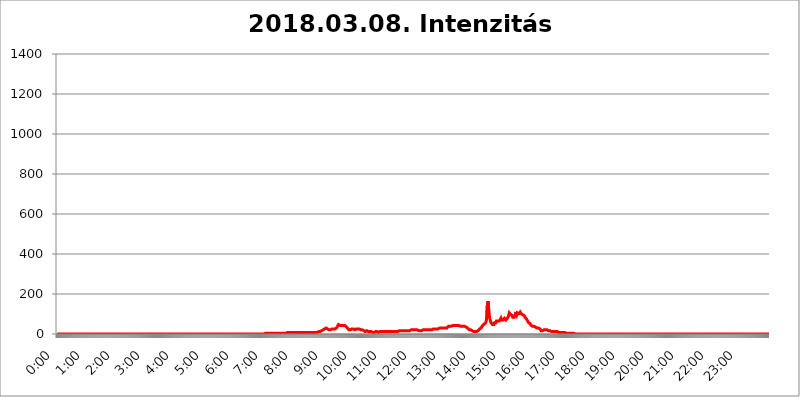
| Category | 2018.03.08. Intenzitás [W/m^2] |
|---|---|
| 0.0 | 0 |
| 0.0006944444444444445 | 0 |
| 0.001388888888888889 | 0 |
| 0.0020833333333333333 | 0 |
| 0.002777777777777778 | 0 |
| 0.003472222222222222 | 0 |
| 0.004166666666666667 | 0 |
| 0.004861111111111111 | 0 |
| 0.005555555555555556 | 0 |
| 0.0062499999999999995 | 0 |
| 0.006944444444444444 | 0 |
| 0.007638888888888889 | 0 |
| 0.008333333333333333 | 0 |
| 0.009027777777777779 | 0 |
| 0.009722222222222222 | 0 |
| 0.010416666666666666 | 0 |
| 0.011111111111111112 | 0 |
| 0.011805555555555555 | 0 |
| 0.012499999999999999 | 0 |
| 0.013194444444444444 | 0 |
| 0.013888888888888888 | 0 |
| 0.014583333333333332 | 0 |
| 0.015277777777777777 | 0 |
| 0.015972222222222224 | 0 |
| 0.016666666666666666 | 0 |
| 0.017361111111111112 | 0 |
| 0.018055555555555557 | 0 |
| 0.01875 | 0 |
| 0.019444444444444445 | 0 |
| 0.02013888888888889 | 0 |
| 0.020833333333333332 | 0 |
| 0.02152777777777778 | 0 |
| 0.022222222222222223 | 0 |
| 0.02291666666666667 | 0 |
| 0.02361111111111111 | 0 |
| 0.024305555555555556 | 0 |
| 0.024999999999999998 | 0 |
| 0.025694444444444447 | 0 |
| 0.02638888888888889 | 0 |
| 0.027083333333333334 | 0 |
| 0.027777777777777776 | 0 |
| 0.02847222222222222 | 0 |
| 0.029166666666666664 | 0 |
| 0.029861111111111113 | 0 |
| 0.030555555555555555 | 0 |
| 0.03125 | 0 |
| 0.03194444444444445 | 0 |
| 0.03263888888888889 | 0 |
| 0.03333333333333333 | 0 |
| 0.034027777777777775 | 0 |
| 0.034722222222222224 | 0 |
| 0.035416666666666666 | 0 |
| 0.036111111111111115 | 0 |
| 0.03680555555555556 | 0 |
| 0.0375 | 0 |
| 0.03819444444444444 | 0 |
| 0.03888888888888889 | 0 |
| 0.03958333333333333 | 0 |
| 0.04027777777777778 | 0 |
| 0.04097222222222222 | 0 |
| 0.041666666666666664 | 0 |
| 0.042361111111111106 | 0 |
| 0.04305555555555556 | 0 |
| 0.043750000000000004 | 0 |
| 0.044444444444444446 | 0 |
| 0.04513888888888889 | 0 |
| 0.04583333333333334 | 0 |
| 0.04652777777777778 | 0 |
| 0.04722222222222222 | 0 |
| 0.04791666666666666 | 0 |
| 0.04861111111111111 | 0 |
| 0.049305555555555554 | 0 |
| 0.049999999999999996 | 0 |
| 0.05069444444444445 | 0 |
| 0.051388888888888894 | 0 |
| 0.052083333333333336 | 0 |
| 0.05277777777777778 | 0 |
| 0.05347222222222222 | 0 |
| 0.05416666666666667 | 0 |
| 0.05486111111111111 | 0 |
| 0.05555555555555555 | 0 |
| 0.05625 | 0 |
| 0.05694444444444444 | 0 |
| 0.057638888888888885 | 0 |
| 0.05833333333333333 | 0 |
| 0.05902777777777778 | 0 |
| 0.059722222222222225 | 0 |
| 0.06041666666666667 | 0 |
| 0.061111111111111116 | 0 |
| 0.06180555555555556 | 0 |
| 0.0625 | 0 |
| 0.06319444444444444 | 0 |
| 0.06388888888888888 | 0 |
| 0.06458333333333334 | 0 |
| 0.06527777777777778 | 0 |
| 0.06597222222222222 | 0 |
| 0.06666666666666667 | 0 |
| 0.06736111111111111 | 0 |
| 0.06805555555555555 | 0 |
| 0.06874999999999999 | 0 |
| 0.06944444444444443 | 0 |
| 0.07013888888888889 | 0 |
| 0.07083333333333333 | 0 |
| 0.07152777777777779 | 0 |
| 0.07222222222222223 | 0 |
| 0.07291666666666667 | 0 |
| 0.07361111111111111 | 0 |
| 0.07430555555555556 | 0 |
| 0.075 | 0 |
| 0.07569444444444444 | 0 |
| 0.0763888888888889 | 0 |
| 0.07708333333333334 | 0 |
| 0.07777777777777778 | 0 |
| 0.07847222222222222 | 0 |
| 0.07916666666666666 | 0 |
| 0.0798611111111111 | 0 |
| 0.08055555555555556 | 0 |
| 0.08125 | 0 |
| 0.08194444444444444 | 0 |
| 0.08263888888888889 | 0 |
| 0.08333333333333333 | 0 |
| 0.08402777777777777 | 0 |
| 0.08472222222222221 | 0 |
| 0.08541666666666665 | 0 |
| 0.08611111111111112 | 0 |
| 0.08680555555555557 | 0 |
| 0.08750000000000001 | 0 |
| 0.08819444444444445 | 0 |
| 0.08888888888888889 | 0 |
| 0.08958333333333333 | 0 |
| 0.09027777777777778 | 0 |
| 0.09097222222222222 | 0 |
| 0.09166666666666667 | 0 |
| 0.09236111111111112 | 0 |
| 0.09305555555555556 | 0 |
| 0.09375 | 0 |
| 0.09444444444444444 | 0 |
| 0.09513888888888888 | 0 |
| 0.09583333333333333 | 0 |
| 0.09652777777777777 | 0 |
| 0.09722222222222222 | 0 |
| 0.09791666666666667 | 0 |
| 0.09861111111111111 | 0 |
| 0.09930555555555555 | 0 |
| 0.09999999999999999 | 0 |
| 0.10069444444444443 | 0 |
| 0.1013888888888889 | 0 |
| 0.10208333333333335 | 0 |
| 0.10277777777777779 | 0 |
| 0.10347222222222223 | 0 |
| 0.10416666666666667 | 0 |
| 0.10486111111111111 | 0 |
| 0.10555555555555556 | 0 |
| 0.10625 | 0 |
| 0.10694444444444444 | 0 |
| 0.1076388888888889 | 0 |
| 0.10833333333333334 | 0 |
| 0.10902777777777778 | 0 |
| 0.10972222222222222 | 0 |
| 0.1111111111111111 | 0 |
| 0.11180555555555556 | 0 |
| 0.11180555555555556 | 0 |
| 0.1125 | 0 |
| 0.11319444444444444 | 0 |
| 0.11388888888888889 | 0 |
| 0.11458333333333333 | 0 |
| 0.11527777777777777 | 0 |
| 0.11597222222222221 | 0 |
| 0.11666666666666665 | 0 |
| 0.1173611111111111 | 0 |
| 0.11805555555555557 | 0 |
| 0.11944444444444445 | 0 |
| 0.12013888888888889 | 0 |
| 0.12083333333333333 | 0 |
| 0.12152777777777778 | 0 |
| 0.12222222222222223 | 0 |
| 0.12291666666666667 | 0 |
| 0.12291666666666667 | 0 |
| 0.12361111111111112 | 0 |
| 0.12430555555555556 | 0 |
| 0.125 | 0 |
| 0.12569444444444444 | 0 |
| 0.12638888888888888 | 0 |
| 0.12708333333333333 | 0 |
| 0.16875 | 0 |
| 0.12847222222222224 | 0 |
| 0.12916666666666668 | 0 |
| 0.12986111111111112 | 0 |
| 0.13055555555555556 | 0 |
| 0.13125 | 0 |
| 0.13194444444444445 | 0 |
| 0.1326388888888889 | 0 |
| 0.13333333333333333 | 0 |
| 0.13402777777777777 | 0 |
| 0.13402777777777777 | 0 |
| 0.13472222222222222 | 0 |
| 0.13541666666666666 | 0 |
| 0.1361111111111111 | 0 |
| 0.13749999999999998 | 0 |
| 0.13819444444444443 | 0 |
| 0.1388888888888889 | 0 |
| 0.13958333333333334 | 0 |
| 0.14027777777777778 | 0 |
| 0.14097222222222222 | 0 |
| 0.14166666666666666 | 0 |
| 0.1423611111111111 | 0 |
| 0.14305555555555557 | 0 |
| 0.14375000000000002 | 0 |
| 0.14444444444444446 | 0 |
| 0.1451388888888889 | 0 |
| 0.1451388888888889 | 0 |
| 0.14652777777777778 | 0 |
| 0.14722222222222223 | 0 |
| 0.14791666666666667 | 0 |
| 0.1486111111111111 | 0 |
| 0.14930555555555555 | 0 |
| 0.15 | 0 |
| 0.15069444444444444 | 0 |
| 0.15138888888888888 | 0 |
| 0.15208333333333332 | 0 |
| 0.15277777777777776 | 0 |
| 0.15347222222222223 | 0 |
| 0.15416666666666667 | 0 |
| 0.15486111111111112 | 0 |
| 0.15555555555555556 | 0 |
| 0.15625 | 0 |
| 0.15694444444444444 | 0 |
| 0.15763888888888888 | 0 |
| 0.15833333333333333 | 0 |
| 0.15902777777777777 | 0 |
| 0.15972222222222224 | 0 |
| 0.16041666666666668 | 0 |
| 0.16111111111111112 | 0 |
| 0.16180555555555556 | 0 |
| 0.1625 | 0 |
| 0.16319444444444445 | 0 |
| 0.1638888888888889 | 0 |
| 0.16458333333333333 | 0 |
| 0.16527777777777777 | 0 |
| 0.16597222222222222 | 0 |
| 0.16666666666666666 | 0 |
| 0.1673611111111111 | 0 |
| 0.16805555555555554 | 0 |
| 0.16874999999999998 | 0 |
| 0.16944444444444443 | 0 |
| 0.17013888888888887 | 0 |
| 0.1708333333333333 | 0 |
| 0.17152777777777775 | 0 |
| 0.17222222222222225 | 0 |
| 0.1729166666666667 | 0 |
| 0.17361111111111113 | 0 |
| 0.17430555555555557 | 0 |
| 0.17500000000000002 | 0 |
| 0.17569444444444446 | 0 |
| 0.1763888888888889 | 0 |
| 0.17708333333333334 | 0 |
| 0.17777777777777778 | 0 |
| 0.17847222222222223 | 0 |
| 0.17916666666666667 | 0 |
| 0.1798611111111111 | 0 |
| 0.18055555555555555 | 0 |
| 0.18125 | 0 |
| 0.18194444444444444 | 0 |
| 0.1826388888888889 | 0 |
| 0.18333333333333335 | 0 |
| 0.1840277777777778 | 0 |
| 0.18472222222222223 | 0 |
| 0.18541666666666667 | 0 |
| 0.18611111111111112 | 0 |
| 0.18680555555555556 | 0 |
| 0.1875 | 0 |
| 0.18819444444444444 | 0 |
| 0.18888888888888888 | 0 |
| 0.18958333333333333 | 0 |
| 0.19027777777777777 | 0 |
| 0.1909722222222222 | 0 |
| 0.19166666666666665 | 0 |
| 0.19236111111111112 | 0 |
| 0.19305555555555554 | 0 |
| 0.19375 | 0 |
| 0.19444444444444445 | 0 |
| 0.1951388888888889 | 0 |
| 0.19583333333333333 | 0 |
| 0.19652777777777777 | 0 |
| 0.19722222222222222 | 0 |
| 0.19791666666666666 | 0 |
| 0.1986111111111111 | 0 |
| 0.19930555555555554 | 0 |
| 0.19999999999999998 | 0 |
| 0.20069444444444443 | 0 |
| 0.20138888888888887 | 0 |
| 0.2020833333333333 | 0 |
| 0.2027777777777778 | 0 |
| 0.2034722222222222 | 0 |
| 0.2041666666666667 | 0 |
| 0.20486111111111113 | 0 |
| 0.20555555555555557 | 0 |
| 0.20625000000000002 | 0 |
| 0.20694444444444446 | 0 |
| 0.2076388888888889 | 0 |
| 0.20833333333333334 | 0 |
| 0.20902777777777778 | 0 |
| 0.20972222222222223 | 0 |
| 0.21041666666666667 | 0 |
| 0.2111111111111111 | 0 |
| 0.21180555555555555 | 0 |
| 0.2125 | 0 |
| 0.21319444444444444 | 0 |
| 0.2138888888888889 | 0 |
| 0.21458333333333335 | 0 |
| 0.2152777777777778 | 0 |
| 0.21597222222222223 | 0 |
| 0.21666666666666667 | 0 |
| 0.21736111111111112 | 0 |
| 0.21805555555555556 | 0 |
| 0.21875 | 0 |
| 0.21944444444444444 | 0 |
| 0.22013888888888888 | 0 |
| 0.22083333333333333 | 0 |
| 0.22152777777777777 | 0 |
| 0.2222222222222222 | 0 |
| 0.22291666666666665 | 0 |
| 0.2236111111111111 | 0 |
| 0.22430555555555556 | 0 |
| 0.225 | 0 |
| 0.22569444444444445 | 0 |
| 0.2263888888888889 | 0 |
| 0.22708333333333333 | 0 |
| 0.22777777777777777 | 0 |
| 0.22847222222222222 | 0 |
| 0.22916666666666666 | 0 |
| 0.2298611111111111 | 0 |
| 0.23055555555555554 | 0 |
| 0.23124999999999998 | 0 |
| 0.23194444444444443 | 0 |
| 0.23263888888888887 | 0 |
| 0.2333333333333333 | 0 |
| 0.2340277777777778 | 0 |
| 0.2347222222222222 | 0 |
| 0.2354166666666667 | 0 |
| 0.23611111111111113 | 0 |
| 0.23680555555555557 | 0 |
| 0.23750000000000002 | 0 |
| 0.23819444444444446 | 0 |
| 0.2388888888888889 | 0 |
| 0.23958333333333334 | 0 |
| 0.24027777777777778 | 0 |
| 0.24097222222222223 | 0 |
| 0.24166666666666667 | 0 |
| 0.2423611111111111 | 0 |
| 0.24305555555555555 | 0 |
| 0.24375 | 0 |
| 0.24444444444444446 | 0 |
| 0.24513888888888888 | 0 |
| 0.24583333333333335 | 0 |
| 0.2465277777777778 | 0 |
| 0.24722222222222223 | 0 |
| 0.24791666666666667 | 0 |
| 0.24861111111111112 | 0 |
| 0.24930555555555556 | 0 |
| 0.25 | 0 |
| 0.25069444444444444 | 0 |
| 0.2513888888888889 | 0 |
| 0.2520833333333333 | 0 |
| 0.25277777777777777 | 0 |
| 0.2534722222222222 | 0 |
| 0.25416666666666665 | 0 |
| 0.2548611111111111 | 0 |
| 0.2555555555555556 | 0 |
| 0.25625000000000003 | 0 |
| 0.2569444444444445 | 0 |
| 0.2576388888888889 | 0 |
| 0.25833333333333336 | 0 |
| 0.2590277777777778 | 0 |
| 0.25972222222222224 | 0 |
| 0.2604166666666667 | 0 |
| 0.2611111111111111 | 0 |
| 0.26180555555555557 | 0 |
| 0.2625 | 0 |
| 0.26319444444444445 | 0 |
| 0.2638888888888889 | 0 |
| 0.26458333333333334 | 0 |
| 0.2652777777777778 | 0 |
| 0.2659722222222222 | 0 |
| 0.26666666666666666 | 0 |
| 0.2673611111111111 | 0 |
| 0.26805555555555555 | 0 |
| 0.26875 | 0 |
| 0.26944444444444443 | 0 |
| 0.2701388888888889 | 0 |
| 0.2708333333333333 | 0 |
| 0.27152777777777776 | 0 |
| 0.2722222222222222 | 0 |
| 0.27291666666666664 | 0 |
| 0.2736111111111111 | 0 |
| 0.2743055555555555 | 0 |
| 0.27499999999999997 | 0 |
| 0.27569444444444446 | 0 |
| 0.27638888888888885 | 0 |
| 0.27708333333333335 | 0 |
| 0.2777777777777778 | 0 |
| 0.27847222222222223 | 0 |
| 0.2791666666666667 | 0 |
| 0.2798611111111111 | 0 |
| 0.28055555555555556 | 0 |
| 0.28125 | 0 |
| 0.28194444444444444 | 0 |
| 0.2826388888888889 | 0 |
| 0.2833333333333333 | 0 |
| 0.28402777777777777 | 0 |
| 0.2847222222222222 | 0 |
| 0.28541666666666665 | 0 |
| 0.28611111111111115 | 0 |
| 0.28680555555555554 | 0 |
| 0.28750000000000003 | 0 |
| 0.2881944444444445 | 0 |
| 0.2888888888888889 | 0 |
| 0.28958333333333336 | 0 |
| 0.2902777777777778 | 0 |
| 0.29097222222222224 | 0 |
| 0.2916666666666667 | 3.525 |
| 0.2923611111111111 | 0 |
| 0.29305555555555557 | 3.525 |
| 0.29375 | 3.525 |
| 0.29444444444444445 | 0 |
| 0.2951388888888889 | 0 |
| 0.29583333333333334 | 3.525 |
| 0.2965277777777778 | 3.525 |
| 0.2972222222222222 | 3.525 |
| 0.29791666666666666 | 3.525 |
| 0.2986111111111111 | 3.525 |
| 0.29930555555555555 | 3.525 |
| 0.3 | 3.525 |
| 0.30069444444444443 | 3.525 |
| 0.3013888888888889 | 3.525 |
| 0.3020833333333333 | 3.525 |
| 0.30277777777777776 | 3.525 |
| 0.3034722222222222 | 3.525 |
| 0.30416666666666664 | 3.525 |
| 0.3048611111111111 | 3.525 |
| 0.3055555555555555 | 3.525 |
| 0.30624999999999997 | 3.525 |
| 0.3069444444444444 | 3.525 |
| 0.3076388888888889 | 3.525 |
| 0.30833333333333335 | 3.525 |
| 0.3090277777777778 | 3.525 |
| 0.30972222222222223 | 3.525 |
| 0.3104166666666667 | 3.525 |
| 0.3111111111111111 | 3.525 |
| 0.31180555555555556 | 3.525 |
| 0.3125 | 3.525 |
| 0.31319444444444444 | 3.525 |
| 0.3138888888888889 | 3.525 |
| 0.3145833333333333 | 3.525 |
| 0.31527777777777777 | 3.525 |
| 0.3159722222222222 | 3.525 |
| 0.31666666666666665 | 3.525 |
| 0.31736111111111115 | 3.525 |
| 0.31805555555555554 | 3.525 |
| 0.31875000000000003 | 3.525 |
| 0.3194444444444445 | 3.525 |
| 0.3201388888888889 | 7.887 |
| 0.32083333333333336 | 3.525 |
| 0.3215277777777778 | 3.525 |
| 0.32222222222222224 | 7.887 |
| 0.3229166666666667 | 7.887 |
| 0.3236111111111111 | 7.887 |
| 0.32430555555555557 | 7.887 |
| 0.325 | 7.887 |
| 0.32569444444444445 | 7.887 |
| 0.3263888888888889 | 7.887 |
| 0.32708333333333334 | 7.887 |
| 0.3277777777777778 | 7.887 |
| 0.3284722222222222 | 7.887 |
| 0.32916666666666666 | 7.887 |
| 0.3298611111111111 | 7.887 |
| 0.33055555555555555 | 7.887 |
| 0.33125 | 7.887 |
| 0.33194444444444443 | 7.887 |
| 0.3326388888888889 | 7.887 |
| 0.3333333333333333 | 7.887 |
| 0.3340277777777778 | 7.887 |
| 0.3347222222222222 | 7.887 |
| 0.3354166666666667 | 7.887 |
| 0.3361111111111111 | 7.887 |
| 0.3368055555555556 | 7.887 |
| 0.33749999999999997 | 7.887 |
| 0.33819444444444446 | 7.887 |
| 0.33888888888888885 | 7.887 |
| 0.33958333333333335 | 7.887 |
| 0.34027777777777773 | 7.887 |
| 0.34097222222222223 | 7.887 |
| 0.3416666666666666 | 7.887 |
| 0.3423611111111111 | 7.887 |
| 0.3430555555555555 | 7.887 |
| 0.34375 | 7.887 |
| 0.3444444444444445 | 7.887 |
| 0.3451388888888889 | 7.887 |
| 0.3458333333333334 | 7.887 |
| 0.34652777777777777 | 7.887 |
| 0.34722222222222227 | 7.887 |
| 0.34791666666666665 | 7.887 |
| 0.34861111111111115 | 7.887 |
| 0.34930555555555554 | 7.887 |
| 0.35000000000000003 | 7.887 |
| 0.3506944444444444 | 7.887 |
| 0.3513888888888889 | 7.887 |
| 0.3520833333333333 | 7.887 |
| 0.3527777777777778 | 7.887 |
| 0.3534722222222222 | 7.887 |
| 0.3541666666666667 | 7.887 |
| 0.3548611111111111 | 7.887 |
| 0.35555555555555557 | 7.887 |
| 0.35625 | 7.887 |
| 0.35694444444444445 | 7.887 |
| 0.3576388888888889 | 7.887 |
| 0.35833333333333334 | 7.887 |
| 0.3590277777777778 | 7.887 |
| 0.3597222222222222 | 7.887 |
| 0.36041666666666666 | 7.887 |
| 0.3611111111111111 | 7.887 |
| 0.36180555555555555 | 7.887 |
| 0.3625 | 7.887 |
| 0.36319444444444443 | 7.887 |
| 0.3638888888888889 | 7.887 |
| 0.3645833333333333 | 7.887 |
| 0.3652777777777778 | 7.887 |
| 0.3659722222222222 | 12.257 |
| 0.3666666666666667 | 12.257 |
| 0.3673611111111111 | 12.257 |
| 0.3680555555555556 | 12.257 |
| 0.36874999999999997 | 12.257 |
| 0.36944444444444446 | 12.257 |
| 0.37013888888888885 | 12.257 |
| 0.37083333333333335 | 16.636 |
| 0.37152777777777773 | 16.636 |
| 0.37222222222222223 | 16.636 |
| 0.3729166666666666 | 21.024 |
| 0.3736111111111111 | 21.024 |
| 0.3743055555555555 | 21.024 |
| 0.375 | 25.419 |
| 0.3756944444444445 | 25.419 |
| 0.3763888888888889 | 25.419 |
| 0.3770833333333334 | 29.823 |
| 0.37777777777777777 | 29.823 |
| 0.37847222222222227 | 25.419 |
| 0.37916666666666665 | 25.419 |
| 0.37986111111111115 | 25.419 |
| 0.38055555555555554 | 25.419 |
| 0.38125000000000003 | 21.024 |
| 0.3819444444444444 | 21.024 |
| 0.3826388888888889 | 21.024 |
| 0.3833333333333333 | 21.024 |
| 0.3840277777777778 | 21.024 |
| 0.3847222222222222 | 25.419 |
| 0.3854166666666667 | 25.419 |
| 0.3861111111111111 | 25.419 |
| 0.38680555555555557 | 21.024 |
| 0.3875 | 25.419 |
| 0.38819444444444445 | 25.419 |
| 0.3888888888888889 | 25.419 |
| 0.38958333333333334 | 25.419 |
| 0.3902777777777778 | 25.419 |
| 0.3909722222222222 | 25.419 |
| 0.39166666666666666 | 29.823 |
| 0.3923611111111111 | 34.234 |
| 0.39305555555555555 | 38.653 |
| 0.39375 | 43.079 |
| 0.39444444444444443 | 47.511 |
| 0.3951388888888889 | 47.511 |
| 0.3958333333333333 | 47.511 |
| 0.3965277777777778 | 43.079 |
| 0.3972222222222222 | 43.079 |
| 0.3979166666666667 | 43.079 |
| 0.3986111111111111 | 43.079 |
| 0.3993055555555556 | 43.079 |
| 0.39999999999999997 | 43.079 |
| 0.40069444444444446 | 43.079 |
| 0.40138888888888885 | 43.079 |
| 0.40208333333333335 | 43.079 |
| 0.40277777777777773 | 43.079 |
| 0.40347222222222223 | 43.079 |
| 0.4041666666666666 | 38.653 |
| 0.4048611111111111 | 38.653 |
| 0.4055555555555555 | 34.234 |
| 0.40625 | 34.234 |
| 0.4069444444444445 | 29.823 |
| 0.4076388888888889 | 29.823 |
| 0.4083333333333334 | 25.419 |
| 0.40902777777777777 | 21.024 |
| 0.40972222222222227 | 25.419 |
| 0.41041666666666665 | 25.419 |
| 0.41111111111111115 | 21.024 |
| 0.41180555555555554 | 21.024 |
| 0.41250000000000003 | 25.419 |
| 0.4131944444444444 | 25.419 |
| 0.4138888888888889 | 25.419 |
| 0.4145833333333333 | 25.419 |
| 0.4152777777777778 | 25.419 |
| 0.4159722222222222 | 25.419 |
| 0.4166666666666667 | 25.419 |
| 0.4173611111111111 | 21.024 |
| 0.41805555555555557 | 25.419 |
| 0.41875 | 25.419 |
| 0.41944444444444445 | 25.419 |
| 0.4201388888888889 | 21.024 |
| 0.42083333333333334 | 25.419 |
| 0.4215277777777778 | 25.419 |
| 0.4222222222222222 | 25.419 |
| 0.42291666666666666 | 25.419 |
| 0.4236111111111111 | 25.419 |
| 0.42430555555555555 | 21.024 |
| 0.425 | 21.024 |
| 0.42569444444444443 | 21.024 |
| 0.4263888888888889 | 16.636 |
| 0.4270833333333333 | 21.024 |
| 0.4277777777777778 | 21.024 |
| 0.4284722222222222 | 21.024 |
| 0.4291666666666667 | 21.024 |
| 0.4298611111111111 | 16.636 |
| 0.4305555555555556 | 16.636 |
| 0.43124999999999997 | 12.257 |
| 0.43194444444444446 | 12.257 |
| 0.43263888888888885 | 12.257 |
| 0.43333333333333335 | 12.257 |
| 0.43402777777777773 | 16.636 |
| 0.43472222222222223 | 16.636 |
| 0.4354166666666666 | 16.636 |
| 0.4361111111111111 | 12.257 |
| 0.4368055555555555 | 12.257 |
| 0.4375 | 12.257 |
| 0.4381944444444445 | 12.257 |
| 0.4388888888888889 | 12.257 |
| 0.4395833333333334 | 12.257 |
| 0.44027777777777777 | 12.257 |
| 0.44097222222222227 | 7.887 |
| 0.44166666666666665 | 7.887 |
| 0.44236111111111115 | 7.887 |
| 0.44305555555555554 | 7.887 |
| 0.44375000000000003 | 7.887 |
| 0.4444444444444444 | 7.887 |
| 0.4451388888888889 | 7.887 |
| 0.4458333333333333 | 12.257 |
| 0.4465277777777778 | 12.257 |
| 0.4472222222222222 | 12.257 |
| 0.4479166666666667 | 12.257 |
| 0.4486111111111111 | 12.257 |
| 0.44930555555555557 | 12.257 |
| 0.45 | 12.257 |
| 0.45069444444444445 | 7.887 |
| 0.4513888888888889 | 12.257 |
| 0.45208333333333334 | 12.257 |
| 0.4527777777777778 | 12.257 |
| 0.4534722222222222 | 12.257 |
| 0.45416666666666666 | 12.257 |
| 0.4548611111111111 | 12.257 |
| 0.45555555555555555 | 12.257 |
| 0.45625 | 12.257 |
| 0.45694444444444443 | 12.257 |
| 0.4576388888888889 | 12.257 |
| 0.4583333333333333 | 12.257 |
| 0.4590277777777778 | 12.257 |
| 0.4597222222222222 | 12.257 |
| 0.4604166666666667 | 12.257 |
| 0.4611111111111111 | 12.257 |
| 0.4618055555555556 | 12.257 |
| 0.46249999999999997 | 12.257 |
| 0.46319444444444446 | 12.257 |
| 0.46388888888888885 | 12.257 |
| 0.46458333333333335 | 12.257 |
| 0.46527777777777773 | 12.257 |
| 0.46597222222222223 | 12.257 |
| 0.4666666666666666 | 12.257 |
| 0.4673611111111111 | 12.257 |
| 0.4680555555555555 | 12.257 |
| 0.46875 | 12.257 |
| 0.4694444444444445 | 12.257 |
| 0.4701388888888889 | 12.257 |
| 0.4708333333333334 | 12.257 |
| 0.47152777777777777 | 12.257 |
| 0.47222222222222227 | 12.257 |
| 0.47291666666666665 | 12.257 |
| 0.47361111111111115 | 12.257 |
| 0.47430555555555554 | 12.257 |
| 0.47500000000000003 | 12.257 |
| 0.4756944444444444 | 12.257 |
| 0.4763888888888889 | 12.257 |
| 0.4770833333333333 | 12.257 |
| 0.4777777777777778 | 12.257 |
| 0.4784722222222222 | 12.257 |
| 0.4791666666666667 | 16.636 |
| 0.4798611111111111 | 16.636 |
| 0.48055555555555557 | 16.636 |
| 0.48125 | 16.636 |
| 0.48194444444444445 | 16.636 |
| 0.4826388888888889 | 16.636 |
| 0.48333333333333334 | 16.636 |
| 0.4840277777777778 | 16.636 |
| 0.4847222222222222 | 16.636 |
| 0.48541666666666666 | 16.636 |
| 0.4861111111111111 | 16.636 |
| 0.48680555555555555 | 16.636 |
| 0.4875 | 16.636 |
| 0.48819444444444443 | 16.636 |
| 0.4888888888888889 | 16.636 |
| 0.4895833333333333 | 16.636 |
| 0.4902777777777778 | 16.636 |
| 0.4909722222222222 | 16.636 |
| 0.4916666666666667 | 16.636 |
| 0.4923611111111111 | 16.636 |
| 0.4930555555555556 | 16.636 |
| 0.49374999999999997 | 16.636 |
| 0.49444444444444446 | 16.636 |
| 0.49513888888888885 | 16.636 |
| 0.49583333333333335 | 16.636 |
| 0.49652777777777773 | 21.024 |
| 0.49722222222222223 | 21.024 |
| 0.4979166666666666 | 21.024 |
| 0.4986111111111111 | 21.024 |
| 0.4993055555555555 | 21.024 |
| 0.5 | 21.024 |
| 0.5006944444444444 | 21.024 |
| 0.5013888888888889 | 16.636 |
| 0.5020833333333333 | 21.024 |
| 0.5027777777777778 | 21.024 |
| 0.5034722222222222 | 16.636 |
| 0.5041666666666667 | 21.024 |
| 0.5048611111111111 | 21.024 |
| 0.5055555555555555 | 16.636 |
| 0.50625 | 16.636 |
| 0.5069444444444444 | 16.636 |
| 0.5076388888888889 | 16.636 |
| 0.5083333333333333 | 16.636 |
| 0.5090277777777777 | 16.636 |
| 0.5097222222222222 | 16.636 |
| 0.5104166666666666 | 16.636 |
| 0.5111111111111112 | 16.636 |
| 0.5118055555555555 | 21.024 |
| 0.5125000000000001 | 21.024 |
| 0.5131944444444444 | 21.024 |
| 0.513888888888889 | 21.024 |
| 0.5145833333333333 | 21.024 |
| 0.5152777777777778 | 21.024 |
| 0.5159722222222222 | 21.024 |
| 0.5166666666666667 | 21.024 |
| 0.517361111111111 | 21.024 |
| 0.5180555555555556 | 21.024 |
| 0.5187499999999999 | 21.024 |
| 0.5194444444444445 | 21.024 |
| 0.5201388888888888 | 21.024 |
| 0.5208333333333334 | 21.024 |
| 0.5215277777777778 | 21.024 |
| 0.5222222222222223 | 21.024 |
| 0.5229166666666667 | 21.024 |
| 0.5236111111111111 | 21.024 |
| 0.5243055555555556 | 21.024 |
| 0.525 | 21.024 |
| 0.5256944444444445 | 21.024 |
| 0.5263888888888889 | 21.024 |
| 0.5270833333333333 | 21.024 |
| 0.5277777777777778 | 25.419 |
| 0.5284722222222222 | 25.419 |
| 0.5291666666666667 | 25.419 |
| 0.5298611111111111 | 25.419 |
| 0.5305555555555556 | 25.419 |
| 0.53125 | 25.419 |
| 0.5319444444444444 | 25.419 |
| 0.5326388888888889 | 25.419 |
| 0.5333333333333333 | 25.419 |
| 0.5340277777777778 | 25.419 |
| 0.5347222222222222 | 29.823 |
| 0.5354166666666667 | 29.823 |
| 0.5361111111111111 | 29.823 |
| 0.5368055555555555 | 29.823 |
| 0.5375 | 29.823 |
| 0.5381944444444444 | 29.823 |
| 0.5388888888888889 | 29.823 |
| 0.5395833333333333 | 29.823 |
| 0.5402777777777777 | 29.823 |
| 0.5409722222222222 | 29.823 |
| 0.5416666666666666 | 29.823 |
| 0.5423611111111112 | 29.823 |
| 0.5430555555555555 | 29.823 |
| 0.5437500000000001 | 29.823 |
| 0.5444444444444444 | 29.823 |
| 0.545138888888889 | 29.823 |
| 0.5458333333333333 | 29.823 |
| 0.5465277777777778 | 29.823 |
| 0.5472222222222222 | 34.234 |
| 0.5479166666666667 | 34.234 |
| 0.548611111111111 | 38.653 |
| 0.5493055555555556 | 38.653 |
| 0.5499999999999999 | 38.653 |
| 0.5506944444444445 | 38.653 |
| 0.5513888888888888 | 38.653 |
| 0.5520833333333334 | 38.653 |
| 0.5527777777777778 | 38.653 |
| 0.5534722222222223 | 38.653 |
| 0.5541666666666667 | 43.079 |
| 0.5548611111111111 | 43.079 |
| 0.5555555555555556 | 43.079 |
| 0.55625 | 43.079 |
| 0.5569444444444445 | 43.079 |
| 0.5576388888888889 | 43.079 |
| 0.5583333333333333 | 43.079 |
| 0.5590277777777778 | 43.079 |
| 0.5597222222222222 | 43.079 |
| 0.5604166666666667 | 43.079 |
| 0.5611111111111111 | 43.079 |
| 0.5618055555555556 | 43.079 |
| 0.5625 | 43.079 |
| 0.5631944444444444 | 43.079 |
| 0.5638888888888889 | 43.079 |
| 0.5645833333333333 | 43.079 |
| 0.5652777777777778 | 38.653 |
| 0.5659722222222222 | 38.653 |
| 0.5666666666666667 | 38.653 |
| 0.5673611111111111 | 38.653 |
| 0.5680555555555555 | 38.653 |
| 0.56875 | 38.653 |
| 0.5694444444444444 | 38.653 |
| 0.5701388888888889 | 38.653 |
| 0.5708333333333333 | 38.653 |
| 0.5715277777777777 | 38.653 |
| 0.5722222222222222 | 34.234 |
| 0.5729166666666666 | 34.234 |
| 0.5736111111111112 | 34.234 |
| 0.5743055555555555 | 29.823 |
| 0.5750000000000001 | 29.823 |
| 0.5756944444444444 | 29.823 |
| 0.576388888888889 | 25.419 |
| 0.5770833333333333 | 25.419 |
| 0.5777777777777778 | 21.024 |
| 0.5784722222222222 | 21.024 |
| 0.5791666666666667 | 21.024 |
| 0.579861111111111 | 21.024 |
| 0.5805555555555556 | 21.024 |
| 0.5812499999999999 | 16.636 |
| 0.5819444444444445 | 16.636 |
| 0.5826388888888888 | 16.636 |
| 0.5833333333333334 | 16.636 |
| 0.5840277777777778 | 12.257 |
| 0.5847222222222223 | 12.257 |
| 0.5854166666666667 | 12.257 |
| 0.5861111111111111 | 12.257 |
| 0.5868055555555556 | 12.257 |
| 0.5875 | 12.257 |
| 0.5881944444444445 | 12.257 |
| 0.5888888888888889 | 12.257 |
| 0.5895833333333333 | 16.636 |
| 0.5902777777777778 | 16.636 |
| 0.5909722222222222 | 21.024 |
| 0.5916666666666667 | 21.024 |
| 0.5923611111111111 | 25.419 |
| 0.5930555555555556 | 25.419 |
| 0.59375 | 29.823 |
| 0.5944444444444444 | 29.823 |
| 0.5951388888888889 | 34.234 |
| 0.5958333333333333 | 38.653 |
| 0.5965277777777778 | 38.653 |
| 0.5972222222222222 | 43.079 |
| 0.5979166666666667 | 47.511 |
| 0.5986111111111111 | 51.951 |
| 0.5993055555555555 | 51.951 |
| 0.6 | 51.951 |
| 0.6006944444444444 | 56.398 |
| 0.6013888888888889 | 60.85 |
| 0.6020833333333333 | 74.246 |
| 0.6027777777777777 | 137.347 |
| 0.6034722222222222 | 146.423 |
| 0.6041666666666666 | 164.605 |
| 0.6048611111111112 | 137.347 |
| 0.6055555555555555 | 137.347 |
| 0.6062500000000001 | 83.205 |
| 0.6069444444444444 | 74.246 |
| 0.607638888888889 | 65.31 |
| 0.6083333333333333 | 56.398 |
| 0.6090277777777778 | 51.951 |
| 0.6097222222222222 | 51.951 |
| 0.6104166666666667 | 47.511 |
| 0.611111111111111 | 47.511 |
| 0.6118055555555556 | 47.511 |
| 0.6124999999999999 | 47.511 |
| 0.6131944444444445 | 56.398 |
| 0.6138888888888888 | 56.398 |
| 0.6145833333333334 | 56.398 |
| 0.6152777777777778 | 56.398 |
| 0.6159722222222223 | 65.31 |
| 0.6166666666666667 | 65.31 |
| 0.6173611111111111 | 65.31 |
| 0.6180555555555556 | 65.31 |
| 0.61875 | 65.31 |
| 0.6194444444444445 | 60.85 |
| 0.6201388888888889 | 65.31 |
| 0.6208333333333333 | 69.775 |
| 0.6215277777777778 | 69.775 |
| 0.6222222222222222 | 78.722 |
| 0.6229166666666667 | 69.775 |
| 0.6236111111111111 | 74.246 |
| 0.6243055555555556 | 69.775 |
| 0.625 | 69.775 |
| 0.6256944444444444 | 69.775 |
| 0.6263888888888889 | 74.246 |
| 0.6270833333333333 | 78.722 |
| 0.6277777777777778 | 78.722 |
| 0.6284722222222222 | 74.246 |
| 0.6291666666666667 | 69.775 |
| 0.6298611111111111 | 69.775 |
| 0.6305555555555555 | 74.246 |
| 0.63125 | 78.722 |
| 0.6319444444444444 | 83.205 |
| 0.6326388888888889 | 87.692 |
| 0.6333333333333333 | 96.682 |
| 0.6340277777777777 | 105.69 |
| 0.6347222222222222 | 105.69 |
| 0.6354166666666666 | 105.69 |
| 0.6361111111111112 | 96.682 |
| 0.6368055555555555 | 92.184 |
| 0.6375000000000001 | 101.184 |
| 0.6381944444444444 | 92.184 |
| 0.638888888888889 | 83.205 |
| 0.6395833333333333 | 78.722 |
| 0.6402777777777778 | 78.722 |
| 0.6409722222222222 | 83.205 |
| 0.6416666666666667 | 83.205 |
| 0.642361111111111 | 92.184 |
| 0.6430555555555556 | 110.201 |
| 0.6437499999999999 | 105.69 |
| 0.6444444444444445 | 96.682 |
| 0.6451388888888888 | 105.69 |
| 0.6458333333333334 | 105.69 |
| 0.6465277777777778 | 101.184 |
| 0.6472222222222223 | 101.184 |
| 0.6479166666666667 | 101.184 |
| 0.6486111111111111 | 105.69 |
| 0.6493055555555556 | 110.201 |
| 0.65 | 105.69 |
| 0.6506944444444445 | 101.184 |
| 0.6513888888888889 | 101.184 |
| 0.6520833333333333 | 101.184 |
| 0.6527777777777778 | 96.682 |
| 0.6534722222222222 | 96.682 |
| 0.6541666666666667 | 92.184 |
| 0.6548611111111111 | 92.184 |
| 0.6555555555555556 | 87.692 |
| 0.65625 | 83.205 |
| 0.6569444444444444 | 83.205 |
| 0.6576388888888889 | 78.722 |
| 0.6583333333333333 | 74.246 |
| 0.6590277777777778 | 69.775 |
| 0.6597222222222222 | 65.31 |
| 0.6604166666666667 | 60.85 |
| 0.6611111111111111 | 56.398 |
| 0.6618055555555555 | 56.398 |
| 0.6625 | 51.951 |
| 0.6631944444444444 | 51.951 |
| 0.6638888888888889 | 47.511 |
| 0.6645833333333333 | 43.079 |
| 0.6652777777777777 | 43.079 |
| 0.6659722222222222 | 38.653 |
| 0.6666666666666666 | 38.653 |
| 0.6673611111111111 | 38.653 |
| 0.6680555555555556 | 38.653 |
| 0.6687500000000001 | 38.653 |
| 0.6694444444444444 | 38.653 |
| 0.6701388888888888 | 34.234 |
| 0.6708333333333334 | 34.234 |
| 0.6715277777777778 | 34.234 |
| 0.6722222222222222 | 34.234 |
| 0.6729166666666666 | 29.823 |
| 0.6736111111111112 | 29.823 |
| 0.6743055555555556 | 29.823 |
| 0.6749999999999999 | 29.823 |
| 0.6756944444444444 | 29.823 |
| 0.6763888888888889 | 25.419 |
| 0.6770833333333334 | 25.419 |
| 0.6777777777777777 | 21.024 |
| 0.6784722222222223 | 16.636 |
| 0.6791666666666667 | 16.636 |
| 0.6798611111111111 | 16.636 |
| 0.6805555555555555 | 16.636 |
| 0.68125 | 16.636 |
| 0.6819444444444445 | 16.636 |
| 0.6826388888888889 | 21.024 |
| 0.6833333333333332 | 21.024 |
| 0.6840277777777778 | 21.024 |
| 0.6847222222222222 | 21.024 |
| 0.6854166666666667 | 21.024 |
| 0.686111111111111 | 21.024 |
| 0.6868055555555556 | 21.024 |
| 0.6875 | 21.024 |
| 0.6881944444444444 | 16.636 |
| 0.688888888888889 | 16.636 |
| 0.6895833333333333 | 16.636 |
| 0.6902777777777778 | 16.636 |
| 0.6909722222222222 | 16.636 |
| 0.6916666666666668 | 16.636 |
| 0.6923611111111111 | 16.636 |
| 0.6930555555555555 | 12.257 |
| 0.69375 | 12.257 |
| 0.6944444444444445 | 12.257 |
| 0.6951388888888889 | 12.257 |
| 0.6958333333333333 | 12.257 |
| 0.6965277777777777 | 12.257 |
| 0.6972222222222223 | 12.257 |
| 0.6979166666666666 | 12.257 |
| 0.6986111111111111 | 12.257 |
| 0.6993055555555556 | 12.257 |
| 0.7000000000000001 | 12.257 |
| 0.7006944444444444 | 12.257 |
| 0.7013888888888888 | 12.257 |
| 0.7020833333333334 | 12.257 |
| 0.7027777777777778 | 12.257 |
| 0.7034722222222222 | 7.887 |
| 0.7041666666666666 | 7.887 |
| 0.7048611111111112 | 7.887 |
| 0.7055555555555556 | 7.887 |
| 0.7062499999999999 | 7.887 |
| 0.7069444444444444 | 7.887 |
| 0.7076388888888889 | 7.887 |
| 0.7083333333333334 | 7.887 |
| 0.7090277777777777 | 7.887 |
| 0.7097222222222223 | 7.887 |
| 0.7104166666666667 | 3.525 |
| 0.7111111111111111 | 7.887 |
| 0.7118055555555555 | 7.887 |
| 0.7125 | 3.525 |
| 0.7131944444444445 | 3.525 |
| 0.7138888888888889 | 3.525 |
| 0.7145833333333332 | 3.525 |
| 0.7152777777777778 | 3.525 |
| 0.7159722222222222 | 3.525 |
| 0.7166666666666667 | 3.525 |
| 0.717361111111111 | 3.525 |
| 0.7180555555555556 | 3.525 |
| 0.71875 | 3.525 |
| 0.7194444444444444 | 3.525 |
| 0.720138888888889 | 3.525 |
| 0.7208333333333333 | 3.525 |
| 0.7215277777777778 | 3.525 |
| 0.7222222222222222 | 3.525 |
| 0.7229166666666668 | 0 |
| 0.7236111111111111 | 3.525 |
| 0.7243055555555555 | 3.525 |
| 0.725 | 0 |
| 0.7256944444444445 | 0 |
| 0.7263888888888889 | 0 |
| 0.7270833333333333 | 0 |
| 0.7277777777777777 | 0 |
| 0.7284722222222223 | 0 |
| 0.7291666666666666 | 0 |
| 0.7298611111111111 | 0 |
| 0.7305555555555556 | 0 |
| 0.7312500000000001 | 0 |
| 0.7319444444444444 | 0 |
| 0.7326388888888888 | 0 |
| 0.7333333333333334 | 0 |
| 0.7340277777777778 | 0 |
| 0.7347222222222222 | 0 |
| 0.7354166666666666 | 0 |
| 0.7361111111111112 | 0 |
| 0.7368055555555556 | 0 |
| 0.7374999999999999 | 0 |
| 0.7381944444444444 | 0 |
| 0.7388888888888889 | 0 |
| 0.7395833333333334 | 0 |
| 0.7402777777777777 | 0 |
| 0.7409722222222223 | 0 |
| 0.7416666666666667 | 0 |
| 0.7423611111111111 | 0 |
| 0.7430555555555555 | 0 |
| 0.74375 | 0 |
| 0.7444444444444445 | 0 |
| 0.7451388888888889 | 0 |
| 0.7458333333333332 | 0 |
| 0.7465277777777778 | 0 |
| 0.7472222222222222 | 0 |
| 0.7479166666666667 | 0 |
| 0.748611111111111 | 0 |
| 0.7493055555555556 | 0 |
| 0.75 | 0 |
| 0.7506944444444444 | 0 |
| 0.751388888888889 | 0 |
| 0.7520833333333333 | 0 |
| 0.7527777777777778 | 0 |
| 0.7534722222222222 | 0 |
| 0.7541666666666668 | 0 |
| 0.7548611111111111 | 0 |
| 0.7555555555555555 | 0 |
| 0.75625 | 0 |
| 0.7569444444444445 | 0 |
| 0.7576388888888889 | 0 |
| 0.7583333333333333 | 0 |
| 0.7590277777777777 | 0 |
| 0.7597222222222223 | 0 |
| 0.7604166666666666 | 0 |
| 0.7611111111111111 | 0 |
| 0.7618055555555556 | 0 |
| 0.7625000000000001 | 0 |
| 0.7631944444444444 | 0 |
| 0.7638888888888888 | 0 |
| 0.7645833333333334 | 0 |
| 0.7652777777777778 | 0 |
| 0.7659722222222222 | 0 |
| 0.7666666666666666 | 0 |
| 0.7673611111111112 | 0 |
| 0.7680555555555556 | 0 |
| 0.7687499999999999 | 0 |
| 0.7694444444444444 | 0 |
| 0.7701388888888889 | 0 |
| 0.7708333333333334 | 0 |
| 0.7715277777777777 | 0 |
| 0.7722222222222223 | 0 |
| 0.7729166666666667 | 0 |
| 0.7736111111111111 | 0 |
| 0.7743055555555555 | 0 |
| 0.775 | 0 |
| 0.7756944444444445 | 0 |
| 0.7763888888888889 | 0 |
| 0.7770833333333332 | 0 |
| 0.7777777777777778 | 0 |
| 0.7784722222222222 | 0 |
| 0.7791666666666667 | 0 |
| 0.779861111111111 | 0 |
| 0.7805555555555556 | 0 |
| 0.78125 | 0 |
| 0.7819444444444444 | 0 |
| 0.782638888888889 | 0 |
| 0.7833333333333333 | 0 |
| 0.7840277777777778 | 0 |
| 0.7847222222222222 | 0 |
| 0.7854166666666668 | 0 |
| 0.7861111111111111 | 0 |
| 0.7868055555555555 | 0 |
| 0.7875 | 0 |
| 0.7881944444444445 | 0 |
| 0.7888888888888889 | 0 |
| 0.7895833333333333 | 0 |
| 0.7902777777777777 | 0 |
| 0.7909722222222223 | 0 |
| 0.7916666666666666 | 0 |
| 0.7923611111111111 | 0 |
| 0.7930555555555556 | 0 |
| 0.7937500000000001 | 0 |
| 0.7944444444444444 | 0 |
| 0.7951388888888888 | 0 |
| 0.7958333333333334 | 0 |
| 0.7965277777777778 | 0 |
| 0.7972222222222222 | 0 |
| 0.7979166666666666 | 0 |
| 0.7986111111111112 | 0 |
| 0.7993055555555556 | 0 |
| 0.7999999999999999 | 0 |
| 0.8006944444444444 | 0 |
| 0.8013888888888889 | 0 |
| 0.8020833333333334 | 0 |
| 0.8027777777777777 | 0 |
| 0.8034722222222223 | 0 |
| 0.8041666666666667 | 0 |
| 0.8048611111111111 | 0 |
| 0.8055555555555555 | 0 |
| 0.80625 | 0 |
| 0.8069444444444445 | 0 |
| 0.8076388888888889 | 0 |
| 0.8083333333333332 | 0 |
| 0.8090277777777778 | 0 |
| 0.8097222222222222 | 0 |
| 0.8104166666666667 | 0 |
| 0.811111111111111 | 0 |
| 0.8118055555555556 | 0 |
| 0.8125 | 0 |
| 0.8131944444444444 | 0 |
| 0.813888888888889 | 0 |
| 0.8145833333333333 | 0 |
| 0.8152777777777778 | 0 |
| 0.8159722222222222 | 0 |
| 0.8166666666666668 | 0 |
| 0.8173611111111111 | 0 |
| 0.8180555555555555 | 0 |
| 0.81875 | 0 |
| 0.8194444444444445 | 0 |
| 0.8201388888888889 | 0 |
| 0.8208333333333333 | 0 |
| 0.8215277777777777 | 0 |
| 0.8222222222222223 | 0 |
| 0.8229166666666666 | 0 |
| 0.8236111111111111 | 0 |
| 0.8243055555555556 | 0 |
| 0.8250000000000001 | 0 |
| 0.8256944444444444 | 0 |
| 0.8263888888888888 | 0 |
| 0.8270833333333334 | 0 |
| 0.8277777777777778 | 0 |
| 0.8284722222222222 | 0 |
| 0.8291666666666666 | 0 |
| 0.8298611111111112 | 0 |
| 0.8305555555555556 | 0 |
| 0.8312499999999999 | 0 |
| 0.8319444444444444 | 0 |
| 0.8326388888888889 | 0 |
| 0.8333333333333334 | 0 |
| 0.8340277777777777 | 0 |
| 0.8347222222222223 | 0 |
| 0.8354166666666667 | 0 |
| 0.8361111111111111 | 0 |
| 0.8368055555555555 | 0 |
| 0.8375 | 0 |
| 0.8381944444444445 | 0 |
| 0.8388888888888889 | 0 |
| 0.8395833333333332 | 0 |
| 0.8402777777777778 | 0 |
| 0.8409722222222222 | 0 |
| 0.8416666666666667 | 0 |
| 0.842361111111111 | 0 |
| 0.8430555555555556 | 0 |
| 0.84375 | 0 |
| 0.8444444444444444 | 0 |
| 0.845138888888889 | 0 |
| 0.8458333333333333 | 0 |
| 0.8465277777777778 | 0 |
| 0.8472222222222222 | 0 |
| 0.8479166666666668 | 0 |
| 0.8486111111111111 | 0 |
| 0.8493055555555555 | 0 |
| 0.85 | 0 |
| 0.8506944444444445 | 0 |
| 0.8513888888888889 | 0 |
| 0.8520833333333333 | 0 |
| 0.8527777777777777 | 0 |
| 0.8534722222222223 | 0 |
| 0.8541666666666666 | 0 |
| 0.8548611111111111 | 0 |
| 0.8555555555555556 | 0 |
| 0.8562500000000001 | 0 |
| 0.8569444444444444 | 0 |
| 0.8576388888888888 | 0 |
| 0.8583333333333334 | 0 |
| 0.8590277777777778 | 0 |
| 0.8597222222222222 | 0 |
| 0.8604166666666666 | 0 |
| 0.8611111111111112 | 0 |
| 0.8618055555555556 | 0 |
| 0.8624999999999999 | 0 |
| 0.8631944444444444 | 0 |
| 0.8638888888888889 | 0 |
| 0.8645833333333334 | 0 |
| 0.8652777777777777 | 0 |
| 0.8659722222222223 | 0 |
| 0.8666666666666667 | 0 |
| 0.8673611111111111 | 0 |
| 0.8680555555555555 | 0 |
| 0.86875 | 0 |
| 0.8694444444444445 | 0 |
| 0.8701388888888889 | 0 |
| 0.8708333333333332 | 0 |
| 0.8715277777777778 | 0 |
| 0.8722222222222222 | 0 |
| 0.8729166666666667 | 0 |
| 0.873611111111111 | 0 |
| 0.8743055555555556 | 0 |
| 0.875 | 0 |
| 0.8756944444444444 | 0 |
| 0.876388888888889 | 0 |
| 0.8770833333333333 | 0 |
| 0.8777777777777778 | 0 |
| 0.8784722222222222 | 0 |
| 0.8791666666666668 | 0 |
| 0.8798611111111111 | 0 |
| 0.8805555555555555 | 0 |
| 0.88125 | 0 |
| 0.8819444444444445 | 0 |
| 0.8826388888888889 | 0 |
| 0.8833333333333333 | 0 |
| 0.8840277777777777 | 0 |
| 0.8847222222222223 | 0 |
| 0.8854166666666666 | 0 |
| 0.8861111111111111 | 0 |
| 0.8868055555555556 | 0 |
| 0.8875000000000001 | 0 |
| 0.8881944444444444 | 0 |
| 0.8888888888888888 | 0 |
| 0.8895833333333334 | 0 |
| 0.8902777777777778 | 0 |
| 0.8909722222222222 | 0 |
| 0.8916666666666666 | 0 |
| 0.8923611111111112 | 0 |
| 0.8930555555555556 | 0 |
| 0.8937499999999999 | 0 |
| 0.8944444444444444 | 0 |
| 0.8951388888888889 | 0 |
| 0.8958333333333334 | 0 |
| 0.8965277777777777 | 0 |
| 0.8972222222222223 | 0 |
| 0.8979166666666667 | 0 |
| 0.8986111111111111 | 0 |
| 0.8993055555555555 | 0 |
| 0.9 | 0 |
| 0.9006944444444445 | 0 |
| 0.9013888888888889 | 0 |
| 0.9020833333333332 | 0 |
| 0.9027777777777778 | 0 |
| 0.9034722222222222 | 0 |
| 0.9041666666666667 | 0 |
| 0.904861111111111 | 0 |
| 0.9055555555555556 | 0 |
| 0.90625 | 0 |
| 0.9069444444444444 | 0 |
| 0.907638888888889 | 0 |
| 0.9083333333333333 | 0 |
| 0.9090277777777778 | 0 |
| 0.9097222222222222 | 0 |
| 0.9104166666666668 | 0 |
| 0.9111111111111111 | 0 |
| 0.9118055555555555 | 0 |
| 0.9125 | 0 |
| 0.9131944444444445 | 0 |
| 0.9138888888888889 | 0 |
| 0.9145833333333333 | 0 |
| 0.9152777777777777 | 0 |
| 0.9159722222222223 | 0 |
| 0.9166666666666666 | 0 |
| 0.9173611111111111 | 0 |
| 0.9180555555555556 | 0 |
| 0.9187500000000001 | 0 |
| 0.9194444444444444 | 0 |
| 0.9201388888888888 | 0 |
| 0.9208333333333334 | 0 |
| 0.9215277777777778 | 0 |
| 0.9222222222222222 | 0 |
| 0.9229166666666666 | 0 |
| 0.9236111111111112 | 0 |
| 0.9243055555555556 | 0 |
| 0.9249999999999999 | 0 |
| 0.9256944444444444 | 0 |
| 0.9263888888888889 | 0 |
| 0.9270833333333334 | 0 |
| 0.9277777777777777 | 0 |
| 0.9284722222222223 | 0 |
| 0.9291666666666667 | 0 |
| 0.9298611111111111 | 0 |
| 0.9305555555555555 | 0 |
| 0.93125 | 0 |
| 0.9319444444444445 | 0 |
| 0.9326388888888889 | 0 |
| 0.9333333333333332 | 0 |
| 0.9340277777777778 | 0 |
| 0.9347222222222222 | 0 |
| 0.9354166666666667 | 0 |
| 0.936111111111111 | 0 |
| 0.9368055555555556 | 0 |
| 0.9375 | 0 |
| 0.9381944444444444 | 0 |
| 0.938888888888889 | 0 |
| 0.9395833333333333 | 0 |
| 0.9402777777777778 | 0 |
| 0.9409722222222222 | 0 |
| 0.9416666666666668 | 0 |
| 0.9423611111111111 | 0 |
| 0.9430555555555555 | 0 |
| 0.94375 | 0 |
| 0.9444444444444445 | 0 |
| 0.9451388888888889 | 0 |
| 0.9458333333333333 | 0 |
| 0.9465277777777777 | 0 |
| 0.9472222222222223 | 0 |
| 0.9479166666666666 | 0 |
| 0.9486111111111111 | 0 |
| 0.9493055555555556 | 0 |
| 0.9500000000000001 | 0 |
| 0.9506944444444444 | 0 |
| 0.9513888888888888 | 0 |
| 0.9520833333333334 | 0 |
| 0.9527777777777778 | 0 |
| 0.9534722222222222 | 0 |
| 0.9541666666666666 | 0 |
| 0.9548611111111112 | 0 |
| 0.9555555555555556 | 0 |
| 0.9562499999999999 | 0 |
| 0.9569444444444444 | 0 |
| 0.9576388888888889 | 0 |
| 0.9583333333333334 | 0 |
| 0.9590277777777777 | 0 |
| 0.9597222222222223 | 0 |
| 0.9604166666666667 | 0 |
| 0.9611111111111111 | 0 |
| 0.9618055555555555 | 0 |
| 0.9625 | 0 |
| 0.9631944444444445 | 0 |
| 0.9638888888888889 | 0 |
| 0.9645833333333332 | 0 |
| 0.9652777777777778 | 0 |
| 0.9659722222222222 | 0 |
| 0.9666666666666667 | 0 |
| 0.967361111111111 | 0 |
| 0.9680555555555556 | 0 |
| 0.96875 | 0 |
| 0.9694444444444444 | 0 |
| 0.970138888888889 | 0 |
| 0.9708333333333333 | 0 |
| 0.9715277777777778 | 0 |
| 0.9722222222222222 | 0 |
| 0.9729166666666668 | 0 |
| 0.9736111111111111 | 0 |
| 0.9743055555555555 | 0 |
| 0.975 | 0 |
| 0.9756944444444445 | 0 |
| 0.9763888888888889 | 0 |
| 0.9770833333333333 | 0 |
| 0.9777777777777777 | 0 |
| 0.9784722222222223 | 0 |
| 0.9791666666666666 | 0 |
| 0.9798611111111111 | 0 |
| 0.9805555555555556 | 0 |
| 0.9812500000000001 | 0 |
| 0.9819444444444444 | 0 |
| 0.9826388888888888 | 0 |
| 0.9833333333333334 | 0 |
| 0.9840277777777778 | 0 |
| 0.9847222222222222 | 0 |
| 0.9854166666666666 | 0 |
| 0.9861111111111112 | 0 |
| 0.9868055555555556 | 0 |
| 0.9874999999999999 | 0 |
| 0.9881944444444444 | 0 |
| 0.9888888888888889 | 0 |
| 0.9895833333333334 | 0 |
| 0.9902777777777777 | 0 |
| 0.9909722222222223 | 0 |
| 0.9916666666666667 | 0 |
| 0.9923611111111111 | 0 |
| 0.9930555555555555 | 0 |
| 0.99375 | 0 |
| 0.9944444444444445 | 0 |
| 0.9951388888888889 | 0 |
| 0.9958333333333332 | 0 |
| 0.9965277777777778 | 0 |
| 0.9972222222222222 | 0 |
| 0.9979166666666667 | 0 |
| 0.998611111111111 | 0 |
| 0.9993055555555556 | 0 |